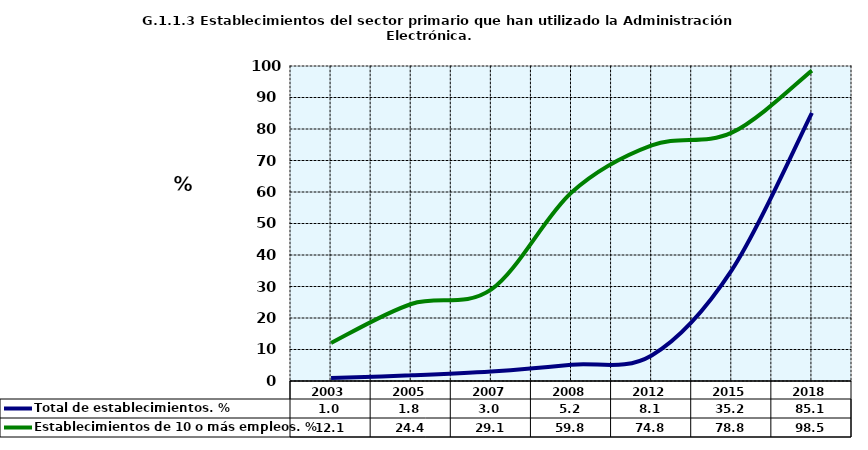
| Category | Total de establecimientos. % | Establecimientos de 10 o más empleos. % |
|---|---|---|
| 2003.0 | 0.969 | 12.077 |
| 2005.0 | 1.791 | 24.444 |
| 2007.0 | 3.033 | 29.082 |
| 2008.0 | 5.176 | 59.848 |
| 2012.0 | 8.118 | 74.8 |
| 2015.0 | 35.191 | 78.832 |
| 2018.0 | 85.112 | 98.519 |